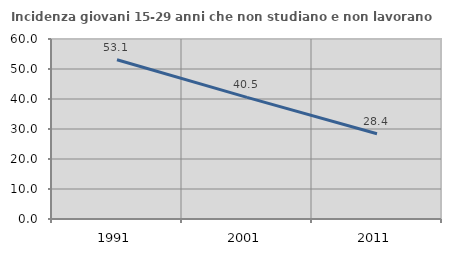
| Category | Incidenza giovani 15-29 anni che non studiano e non lavorano  |
|---|---|
| 1991.0 | 53.086 |
| 2001.0 | 40.538 |
| 2011.0 | 28.439 |